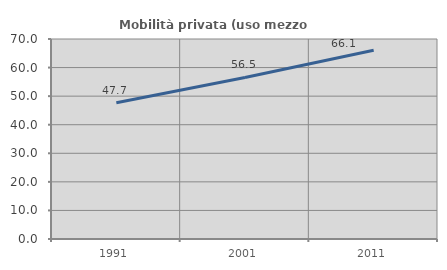
| Category | Mobilità privata (uso mezzo privato) |
|---|---|
| 1991.0 | 47.718 |
| 2001.0 | 56.533 |
| 2011.0 | 66.092 |